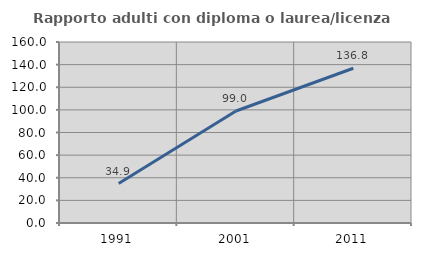
| Category | Rapporto adulti con diploma o laurea/licenza media  |
|---|---|
| 1991.0 | 34.884 |
| 2001.0 | 98.99 |
| 2011.0 | 136.782 |